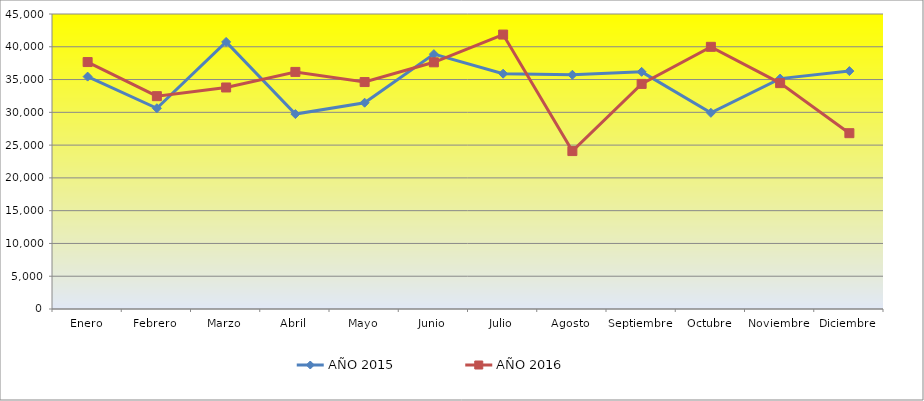
| Category | AÑO 2015 | AÑO 2016 |
|---|---|---|
| Enero | 35449 | 37669 |
| Febrero | 30621 | 32467 |
| Marzo | 40742 | 33792 |
| Abril | 29733 | 36166 |
| Mayo | 31469 | 34618 |
| Junio | 38877 | 37630 |
| Julio | 35894 | 41862 |
| Agosto | 35730 | 24091 |
| Septiembre | 36176 | 34336 |
| Octubre | 29926 | 39993 |
| Noviembre | 35147 | 34455 |
| Diciembre | 36289 | 26820 |